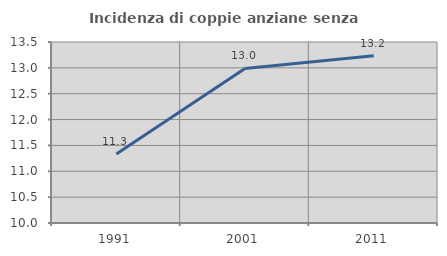
| Category | Incidenza di coppie anziane senza figli  |
|---|---|
| 1991.0 | 11.336 |
| 2001.0 | 12.989 |
| 2011.0 | 13.235 |